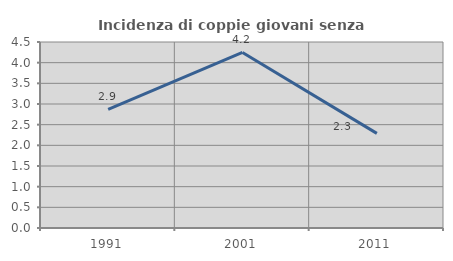
| Category | Incidenza di coppie giovani senza figli |
|---|---|
| 1991.0 | 2.869 |
| 2001.0 | 4.247 |
| 2011.0 | 2.29 |